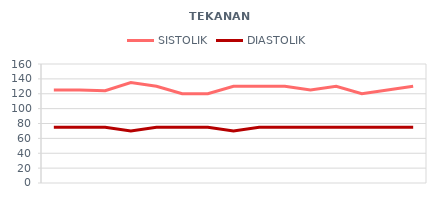
| Category | SISTOLIK | DIASTOLIK |
|---|---|---|
| 6/1/12 | 125 | 75 |
| 6/2/12 | 125 | 75 |
| 6/3/12 | 124 | 75 |
| 6/4/12 | 135 | 70 |
| 6/5/12 | 130 | 75 |
| 6/6/12 | 120 | 75 |
| 6/7/12 | 120 | 75 |
| 6/8/12 | 130 | 70 |
| 6/9/12 | 130 | 75 |
| 6/10/12 | 130 | 75 |
| 6/11/12 | 125 | 75 |
| 6/12/12 | 130 | 75 |
| 6/13/12 | 120 | 75 |
| 6/14/12 | 125 | 75 |
| 6/15/12 | 130 | 75 |